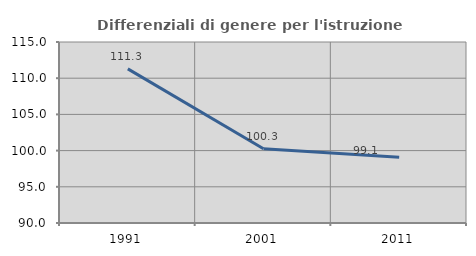
| Category | Differenziali di genere per l'istruzione superiore |
|---|---|
| 1991.0 | 111.289 |
| 2001.0 | 100.263 |
| 2011.0 | 99.069 |